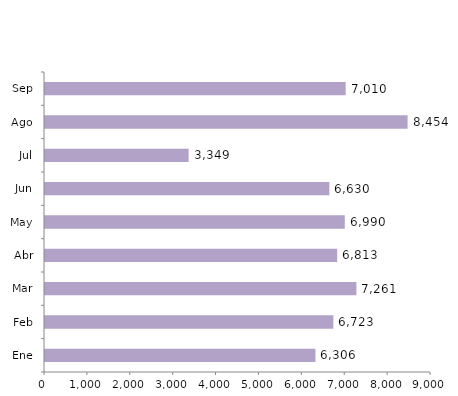
| Category | Series 0 |
|---|---|
| Ene | 6306 |
| Feb | 6723 |
| Mar | 7261 |
| Abr | 6813 |
| May | 6990 |
| Jun | 6630 |
| Jul | 3349 |
| Ago | 8454 |
| Sep | 7010 |